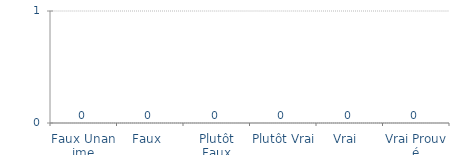
| Category | Series 0 |
|---|---|
| Faux Unanime | 0 |
| Faux  | 0 |
| Plutôt Faux | 0 |
| Plutôt Vrai | 0 |
| Vrai  | 0 |
| Vrai Prouvé | 0 |